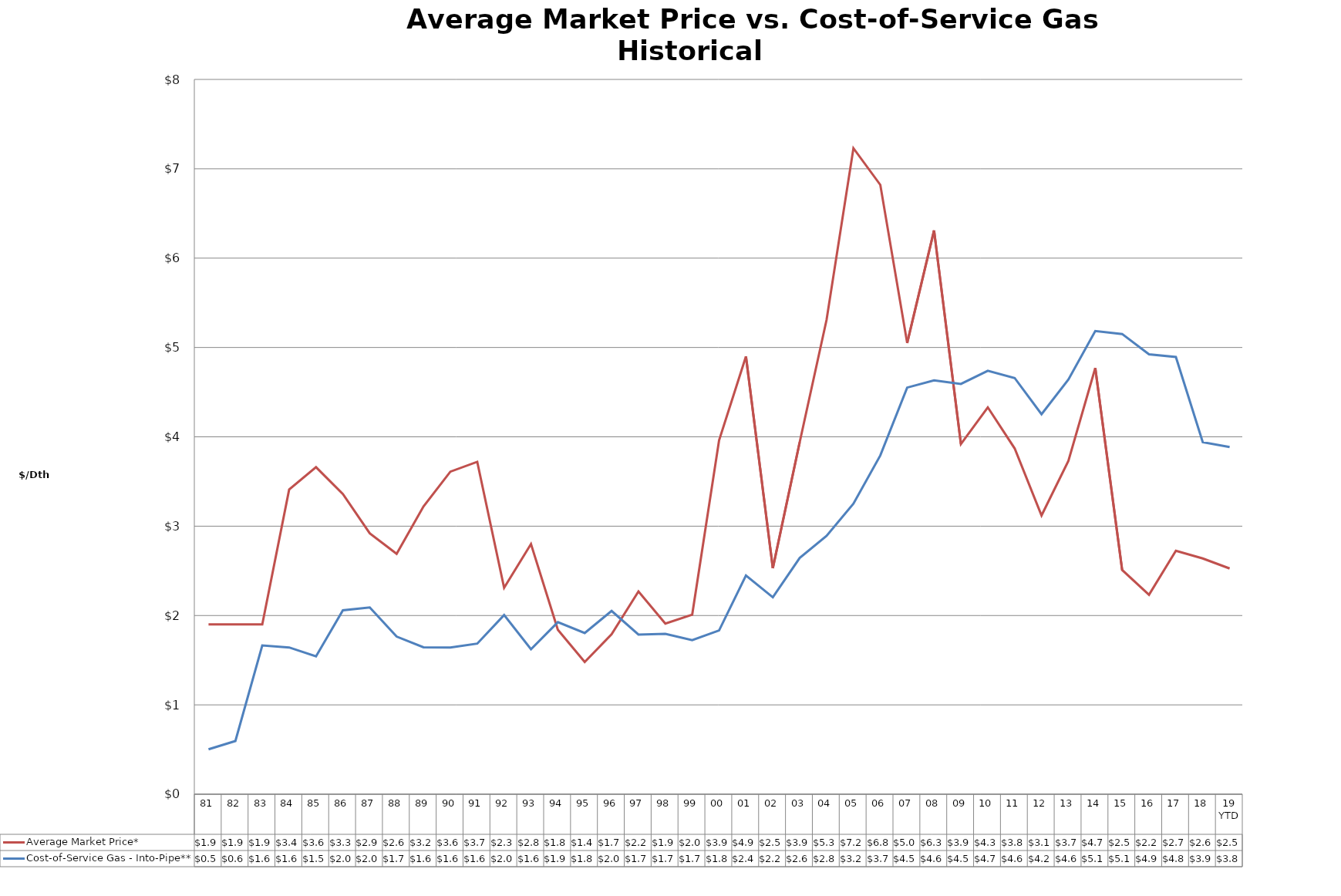
| Category | Average Market Price* | Cost-of-Service Gas - Into-Pipe** |
|---|---|---|
| 81 | 1.9 | 0.502 |
| 82 | 1.9 | 0.596 |
| 83 | 1.9 | 1.665 |
| 84 | 3.41 | 1.643 |
| 85 | 3.66 | 1.543 |
| 86 | 3.36 | 2.059 |
| 87 | 2.92 | 2.091 |
| 88 | 2.69 | 1.764 |
| 89 | 3.22 | 1.644 |
| 90 | 3.61 | 1.642 |
| 91 | 3.72 | 1.685 |
| 92 | 2.31 | 2.005 |
| 93 | 2.8 | 1.623 |
| 94 | 1.84 | 1.926 |
| 95 | 1.48 | 1.804 |
| 96 | 1.79 | 2.052 |
| 97 | 2.27 | 1.787 |
| 98 | 1.91 | 1.795 |
| 99 | 2.01 | 1.725 |
| 00 | 3.96 | 1.833 |
| 01 | 4.9 | 2.448 |
| 02 | 2.53 | 2.204 |
| 03 | 3.94 | 2.644 |
| 04 | 5.31 | 2.891 |
| 05 | 7.23 | 3.251 |
| 06 | 6.82 | 3.792 |
| 07 | 5.05 | 4.551 |
| 08 | 6.31 | 4.632 |
| 09 | 3.92 | 4.592 |
| 10 | 4.33 | 4.74 |
| 11 | 3.87 | 4.658 |
| 12 | 3.12 | 4.253 |
| 13 | 3.73 | 4.641 |
| 14 | 4.77 | 5.184 |
| 15 | 2.51 | 5.151 |
| 16 | 2.233 | 4.923 |
| 17 | 2.725 | 4.894 |
| 18 | 2.639 | 3.94 |
| 19 YTD | 2.526 | 3.886 |